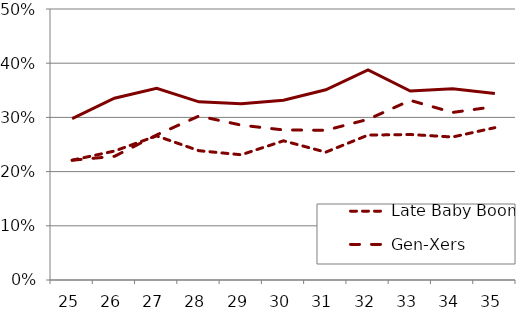
| Category | Late Baby Boomers | Gen-Xers | Millennials |
|---|---|---|---|
| 25.0 | 0.221 | 0.221 | 0.298 |
| 26.0 | 0.238 | 0.228 | 0.335 |
| 27.0 | 0.266 | 0.268 | 0.354 |
| 28.0 | 0.239 | 0.303 | 0.329 |
| 29.0 | 0.231 | 0.286 | 0.325 |
| 30.0 | 0.257 | 0.277 | 0.332 |
| 31.0 | 0.236 | 0.276 | 0.351 |
| 32.0 | 0.267 | 0.296 | 0.388 |
| 33.0 | 0.268 | 0.331 | 0.349 |
| 34.0 | 0.264 | 0.309 | 0.353 |
| 35.0 | 0.281 | 0.32 | 0.344 |